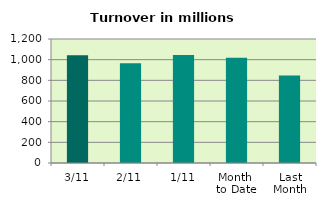
| Category | Series 0 |
|---|---|
| 3/11 | 1043.803 |
| 2/11 | 964.299 |
| 1/11 | 1044.007 |
| Month 
to Date | 1017.37 |
| Last
Month | 847.422 |